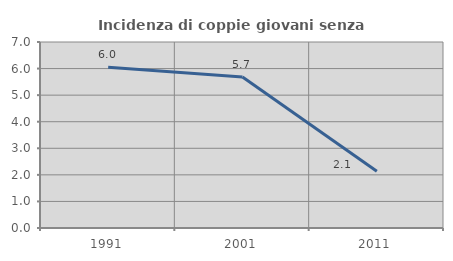
| Category | Incidenza di coppie giovani senza figli |
|---|---|
| 1991.0 | 6.048 |
| 2001.0 | 5.682 |
| 2011.0 | 2.135 |